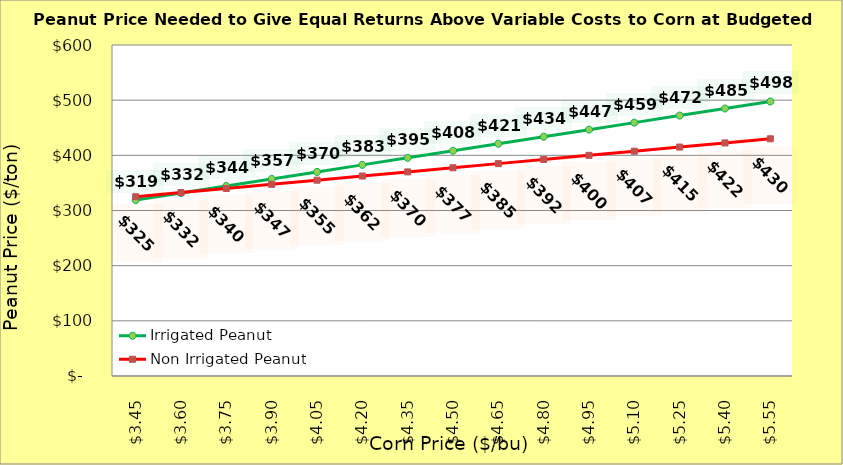
| Category | Irrigated Peanut | Non Irrigated Peanut |
|---|---|---|
| 3.4499999999999993 | 318.895 | 324.974 |
| 3.599999999999999 | 331.661 | 332.474 |
| 3.749999999999999 | 344.426 | 339.974 |
| 3.899999999999999 | 357.192 | 347.474 |
| 4.049999999999999 | 369.958 | 354.974 |
| 4.199999999999999 | 382.724 | 362.474 |
| 4.35 | 395.49 | 369.974 |
| 4.5 | 408.256 | 377.474 |
| 4.65 | 421.022 | 384.974 |
| 4.800000000000001 | 433.788 | 392.474 |
| 4.950000000000001 | 446.554 | 399.974 |
| 5.100000000000001 | 459.32 | 407.474 |
| 5.250000000000002 | 472.086 | 414.974 |
| 5.400000000000002 | 484.852 | 422.474 |
| 5.5500000000000025 | 497.618 | 429.974 |